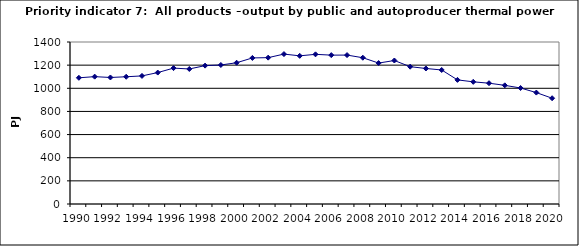
| Category | All products –output by public and autoproducer thermal power stations, PJ |
|---|---|
| 1990 | 1090.57 |
| 1991 | 1100.534 |
| 1992 | 1093.374 |
| 1993 | 1099.559 |
| 1994 | 1106.914 |
| 1995 | 1135.836 |
| 1996 | 1174.446 |
| 1997 | 1166.879 |
| 1998 | 1195.704 |
| 1999 | 1201.342 |
| 2000 | 1220.72 |
| 2001 | 1262.286 |
| 2002 | 1264.831 |
| 2003 | 1295.519 |
| 2004 | 1280.393 |
| 2005 | 1293.417 |
| 2006 | 1286.566 |
| 2007 | 1286.849 |
| 2008 | 1264.14 |
| 2009 | 1217.972 |
| 2010 | 1240.045 |
| 2011 | 1186.68 |
| 2012 | 1171.169 |
| 2013 | 1158.187 |
| 2014 | 1072.578 |
| 2015 | 1055.705 |
| 2016 | 1043.943 |
| 2017 | 1025.54 |
| 2018 | 1002.424 |
| 2019 | 962.824 |
| 2020 | 914.062 |